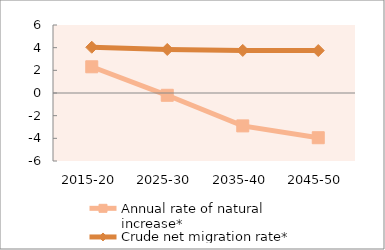
| Category | Annual rate of natural increase* | Crude net migration rate* |
|---|---|---|
| 2015-20 | 2.313 | 4.037 |
| 2025-30 | -0.202 | 3.839 |
| 2035-40 | -2.902 | 3.756 |
| 2045-50 | -3.946 | 3.746 |